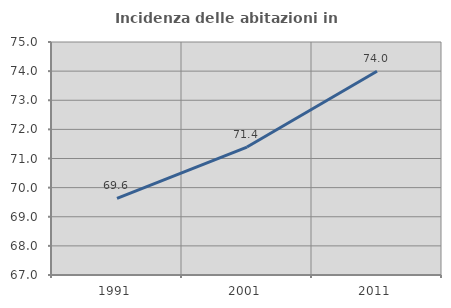
| Category | Incidenza delle abitazioni in proprietà  |
|---|---|
| 1991.0 | 69.632 |
| 2001.0 | 71.393 |
| 2011.0 | 73.998 |